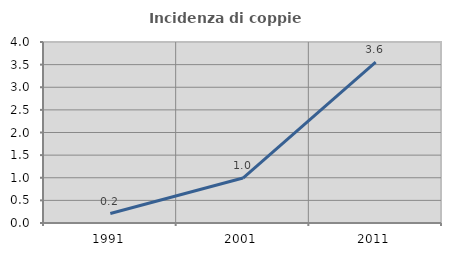
| Category | Incidenza di coppie miste |
|---|---|
| 1991.0 | 0.208 |
| 2001.0 | 0.993 |
| 2011.0 | 3.557 |